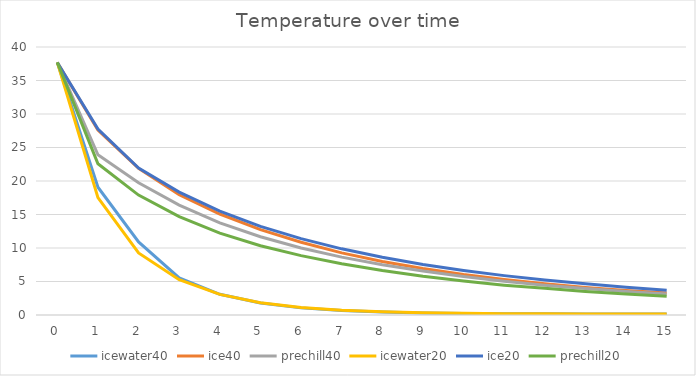
| Category | icewater40 | ice40 | prechill40 | icewater20 | ice20 | prechill20 |
|---|---|---|---|---|---|---|
| 0 | 37.7 | 37.7 | 37.7 | 37.7 | 37.7 | 37.7 |
| 1 | 19.07 | 27.596 | 23.906 | 17.528 | 27.74 | 22.567 |
| 2 | 10.897 | 21.876 | 19.739 | 9.259 | 21.94 | 17.896 |
| 3 | 5.534 | 17.949 | 16.412 | 5.262 | 18.347 | 14.676 |
| 4 | 3.091 | 15.075 | 13.755 | 3.073 | 15.504 | 12.226 |
| 5 | 1.783 | 12.749 | 11.684 | 1.837 | 13.223 | 10.336 |
| 6 | 1.063 | 10.853 | 9.993 | 1.123 | 11.4 | 8.863 |
| 7 | 0.662 | 9.273 | 8.635 | 0.709 | 9.875 | 7.648 |
| 8 | 0.44 | 7.99 | 7.507 | 0.467 | 8.619 | 6.629 |
| 9 | 0.312 | 6.941 | 6.555 | 0.326 | 7.543 | 5.776 |
| 10 | 0.241 | 6.048 | 5.738 | 0.245 | 6.654 | 5.06 |
| 11 | 0.199 | 5.298 | 5.049 | 0.198 | 5.879 | 4.455 |
| 12 | 0.177 | 4.665 | 4.447 | 0.17 | 5.22 | 3.983 |
| 13 | 0.163 | 4.121 | 3.944 | 0.155 | 4.649 | 3.502 |
| 14 | 0.158 | 3.665 | 3.514 | 0.146 | 4.138 | 3.123 |
| 15 | 0.153 | 3.272 | 3.142 | 0.143 | 3.693 | 2.798 |